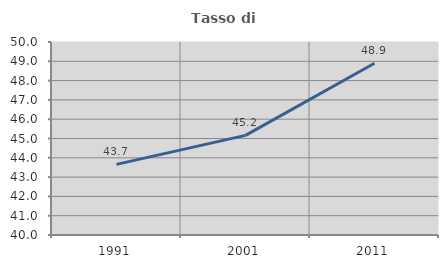
| Category | Tasso di occupazione   |
|---|---|
| 1991.0 | 43.658 |
| 2001.0 | 45.161 |
| 2011.0 | 48.9 |